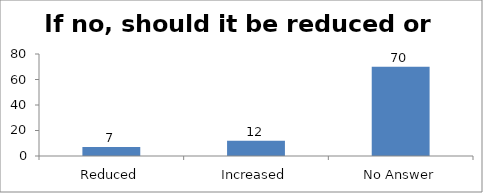
| Category | If no, should it be reduced or increased |
|---|---|
| Reduced | 7 |
| Increased | 12 |
| No Answer | 70 |